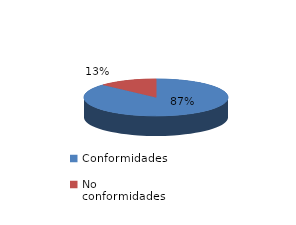
| Category | Series 0 |
|---|---|
| Conformidades | 3412 |
| No conformidades | 517 |